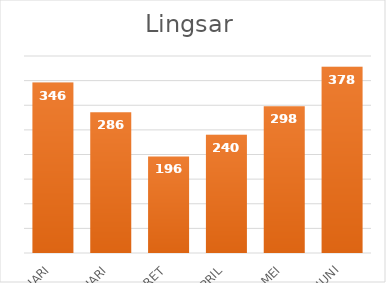
| Category |  346  |
|---|---|
| JANUARI | 346 |
| PEBRUARI | 286 |
| MARET | 196 |
| APRIL | 240 |
| MEI | 298 |
| JUNI | 378 |